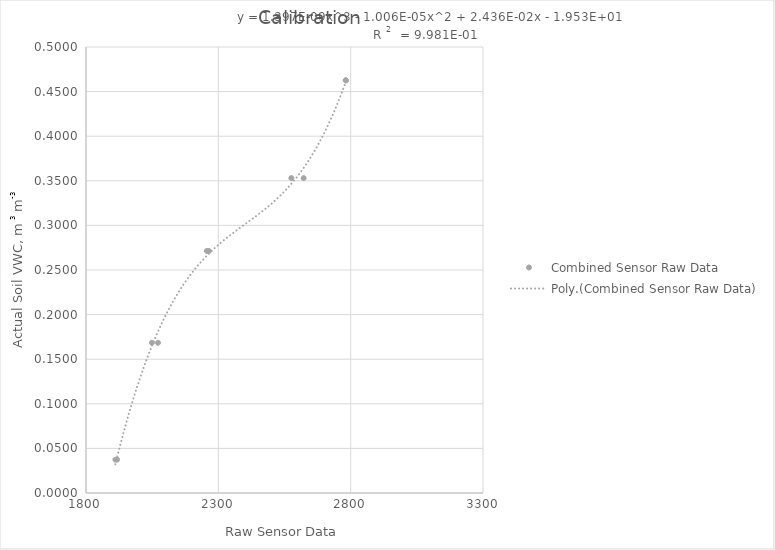
| Category | Combined Sensor Raw Data |
|---|---|
| 1917.5 | 0.037 |
| 2071.9 | 0.168 |
| 2264.2 | 0.271 |
| 2575.8 | 0.353 |
| 2781.9 | 0.463 |
| 1911.1 | 0.037 |
| 2049.1 | 0.168 |
| 2256.8 | 0.271 |
| 2622.4 | 0.353 |
| 2781.5 | 0.463 |